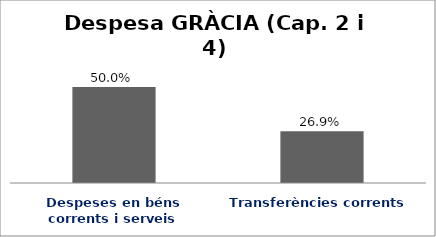
| Category | Series 0 |
|---|---|
| Despeses en béns corrents i serveis | 0.5 |
| Transferències corrents | 0.269 |